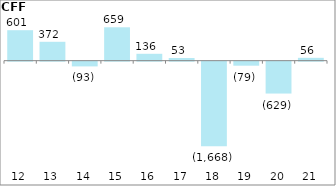
| Category | Series 0 |
|---|---|
| 2012-03-31 | 601.37 |
| 2013-03-31 | 372.42 |
| 2014-03-31 | -93.46 |
| 2015-03-31 | 658.7 |
| 2016-03-31 | 135.52 |
| 2017-03-31 | 53.2 |
| 2018-03-31 | -1668.06 |
| 2019-03-31 | -79.39 |
| 2020-03-31 | -629.23 |
| 2021-03-31 | 56.01 |